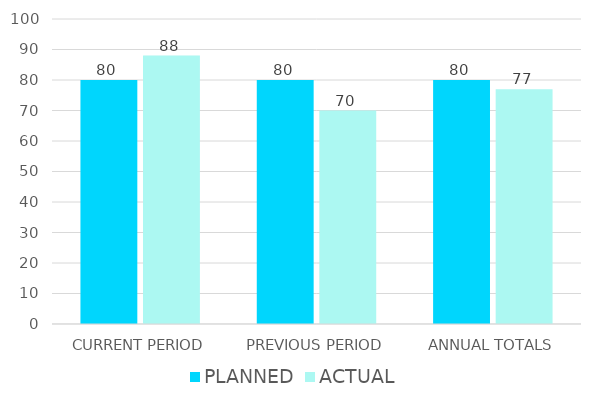
| Category | PLANNED | ACTUAL |
|---|---|---|
| CURRENT PERIOD | 80 | 88 |
| PREVIOUS PERIOD | 80 | 70 |
| ANNUAL TOTALS | 80 | 77 |